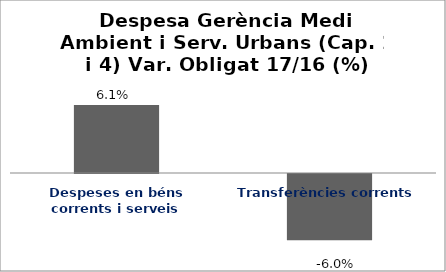
| Category | Series 0 |
|---|---|
| Despeses en béns corrents i serveis | 0.061 |
| Transferències corrents | -0.06 |